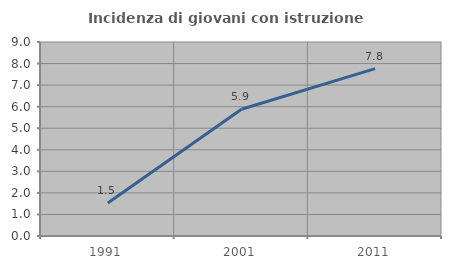
| Category | Incidenza di giovani con istruzione universitaria |
|---|---|
| 1991.0 | 1.531 |
| 2001.0 | 5.882 |
| 2011.0 | 7.767 |